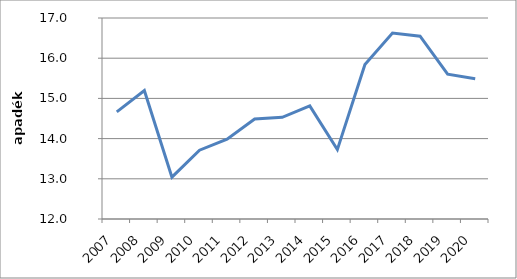
| Category | apadék |
|---|---|
| 2007.0 | 14.664 |
| 2008.0 | 15.198 |
| 2009.0 | 13.04 |
| 2010.0 | 13.711 |
| 2011.0 | 13.985 |
| 2012.0 | 14.488 |
| 2013.0 | 14.53 |
| 2014.0 | 14.815 |
| 2015.0 | 13.727 |
| 2016.0 | 15.843 |
| 2017.0 | 16.626 |
| 2018.0 | 16.549 |
| 2019.0 | 15.602 |
| 2020.0 | 15.49 |